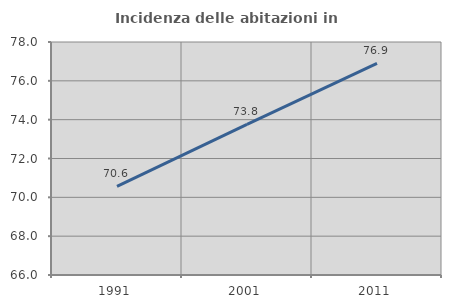
| Category | Incidenza delle abitazioni in proprietà  |
|---|---|
| 1991.0 | 70.568 |
| 2001.0 | 73.759 |
| 2011.0 | 76.902 |